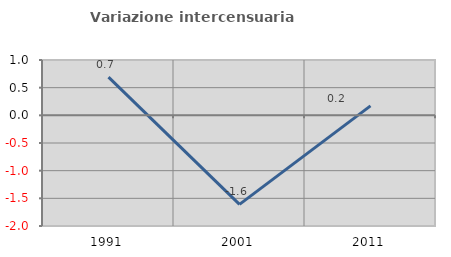
| Category | Variazione intercensuaria annua |
|---|---|
| 1991.0 | 0.692 |
| 2001.0 | -1.609 |
| 2011.0 | 0.172 |